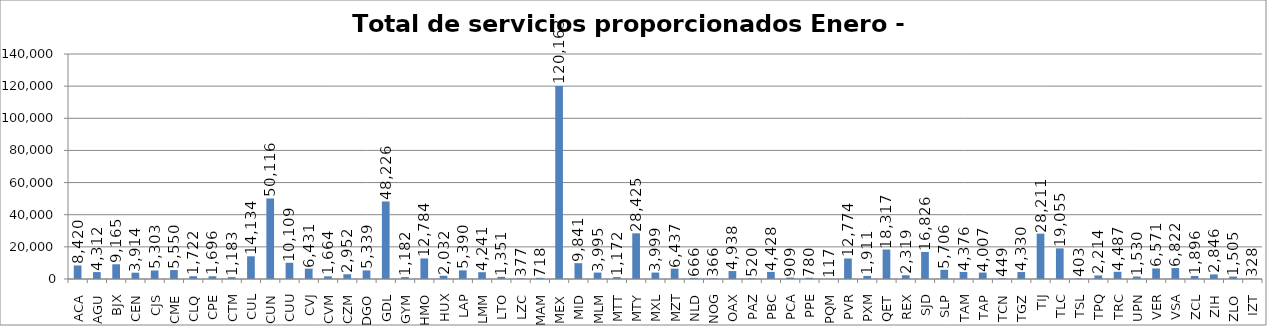
| Category | Total de servicios proporcionados Enero - Diciembre |
|---|---|
| ACA | 8420 |
| AGU | 4312 |
| BJX | 9165 |
| CEN | 3914 |
| CJS | 5303 |
| CME | 5550 |
| CLQ | 1722 |
| CPE | 1696 |
| CTM | 1183 |
| CUL | 14134 |
| CUN | 50116 |
| CUU | 10109 |
| CVJ | 6431 |
| CVM | 1664 |
| CZM | 2952 |
| DGO | 5339 |
| GDL | 48226 |
| GYM | 1182 |
| HMO | 12784 |
| HUX | 2032 |
| LAP | 5390 |
| LMM | 4241 |
| LTO | 1351 |
| LZC | 377 |
| MAM | 718 |
| MEX | 120163 |
| MID | 9841 |
| MLM | 3995 |
| MTT | 1172 |
| MTY | 28425 |
| MXL | 3999 |
| MZT | 6437 |
| NLD | 666 |
| NOG | 366 |
| OAX | 4938 |
| PAZ | 520 |
| PBC | 4428 |
| PCA | 909 |
| PPE | 780 |
| PQM | 117 |
| PVR | 12774 |
| PXM | 1911 |
| QET | 18317 |
| REX | 2319 |
| SJD | 16826 |
| SLP | 5706 |
| TAM | 4376 |
| TAP | 4007 |
| TCN | 449 |
| TGZ | 4330 |
| TIJ | 28211 |
| TLC | 19055 |
| TSL | 403 |
| TPQ | 2214 |
| TRC | 4487 |
| UPN | 1530 |
| VER | 6571 |
| VSA | 6822 |
| ZCL | 1896 |
| ZIH | 2846 |
| ZLO | 1505 |
| IZT | 328 |